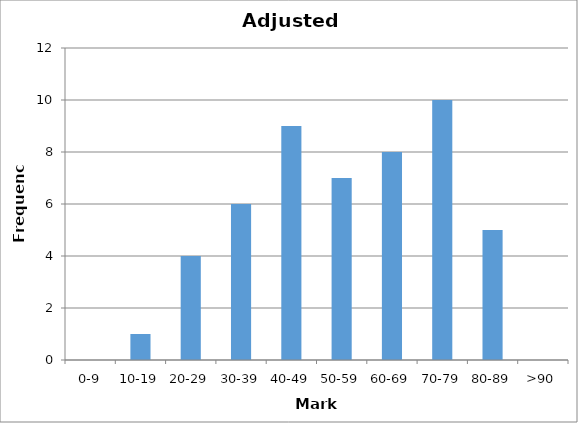
| Category | Series 0 |
|---|---|
| 0-9 | 0 |
| 10-19 | 1 |
| 20-29 | 4 |
| 30-39 | 6 |
| 40-49 | 9 |
| 50-59 | 7 |
| 60-69 | 8 |
| 70-79 | 10 |
| 80-89 | 5 |
| >90 | 0 |